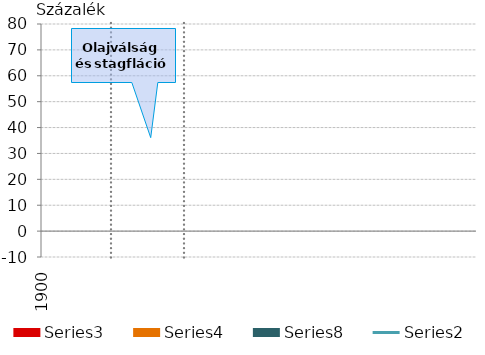
| Category | Series 1 |
|---|---|
| 0 | 1 |